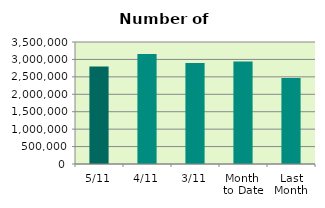
| Category | Series 0 |
|---|---|
| 5/11 | 2797884 |
| 4/11 | 3154480 |
| 3/11 | 2894018 |
| Month 
to Date | 2937766 |
| Last
Month | 2465363.545 |